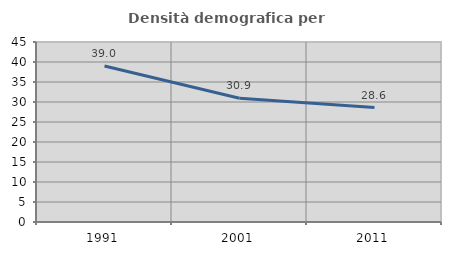
| Category | Densità demografica |
|---|---|
| 1991.0 | 39.002 |
| 2001.0 | 30.918 |
| 2011.0 | 28.624 |